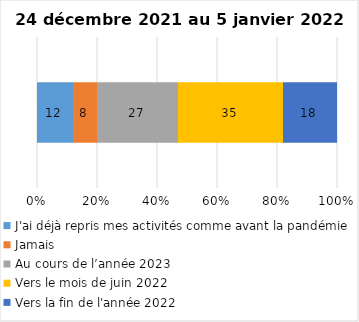
| Category | J'ai déjà repris mes activités comme avant la pandémie | Jamais | Au cours de l’année 2023 | Vers le mois de juin 2022 | Vers la fin de l'année 2022 |
|---|---|---|---|---|---|
| 0 | 12 | 8 | 27 | 35 | 18 |